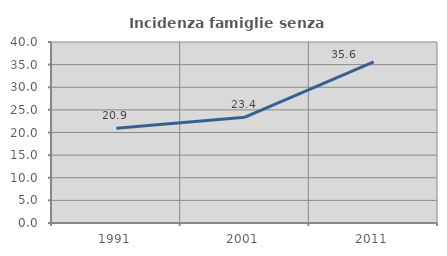
| Category | Incidenza famiglie senza nuclei |
|---|---|
| 1991.0 | 20.929 |
| 2001.0 | 23.388 |
| 2011.0 | 35.597 |